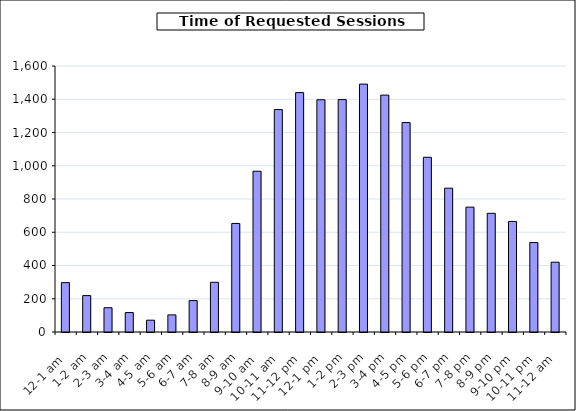
| Category | Series 0 |
|---|---|
| 12-1 am | 297 |
| 1-2 am | 219 |
| 2-3 am | 146 |
| 3-4 am | 117 |
| 4-5 am | 71 |
| 5-6 am | 103 |
| 6-7 am | 189 |
| 7-8 am | 299 |
| 8-9 am | 653 |
| 9-10 am | 967 |
| 10-11 am | 1338 |
| 11-12 pm | 1440 |
| 12-1 pm | 1397 |
| 1-2 pm | 1398 |
| 2-3 pm | 1491 |
| 3-4 pm | 1425 |
| 4-5 pm | 1260 |
| 5-6 pm | 1051 |
| 6-7 pm | 865 |
| 7-8 pm | 751 |
| 8-9 pm | 714 |
| 9-10 pm | 665 |
| 10-11 pm | 538 |
| 11-12 am | 420 |